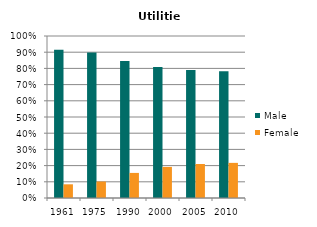
| Category | Male | Female |
|---|---|---|
| 1961.0 | 0.915 | 0.085 |
| 1975.0 | 0.898 | 0.102 |
| 1990.0 | 0.845 | 0.155 |
| 2000.0 | 0.808 | 0.192 |
| 2005.0 | 0.79 | 0.21 |
| 2010.0 | 0.783 | 0.217 |